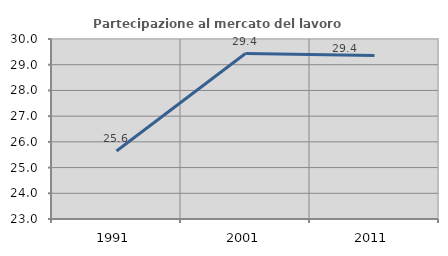
| Category | Partecipazione al mercato del lavoro  femminile |
|---|---|
| 1991.0 | 25.646 |
| 2001.0 | 29.435 |
| 2011.0 | 29.36 |